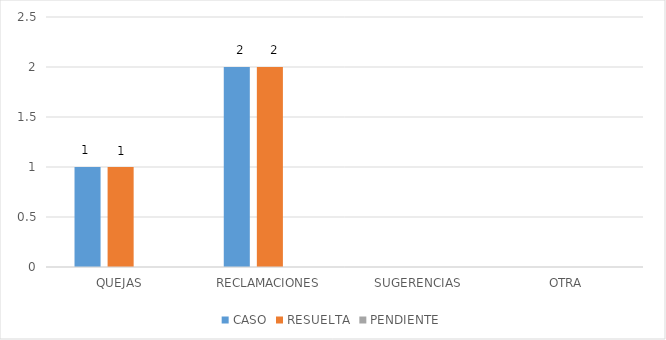
| Category | CASO | RESUELTA | PENDIENTE |
|---|---|---|---|
| QUEJAS | 1 | 1 | 0 |
| RECLAMACIONES | 2 | 2 | 0 |
| SUGERENCIAS | 0 | 0 | 0 |
| OTRA | 0 | 0 | 0 |